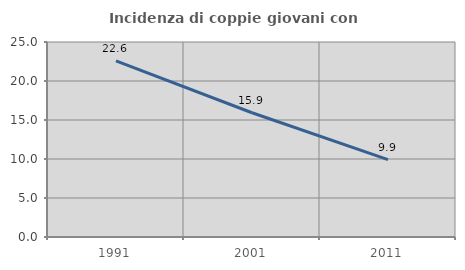
| Category | Incidenza di coppie giovani con figli |
|---|---|
| 1991.0 | 22.588 |
| 2001.0 | 15.928 |
| 2011.0 | 9.924 |